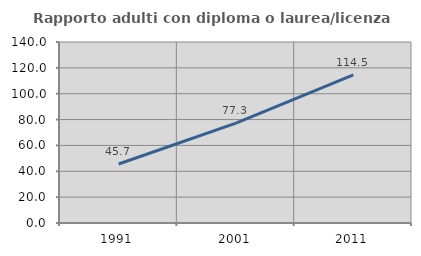
| Category | Rapporto adulti con diploma o laurea/licenza media  |
|---|---|
| 1991.0 | 45.659 |
| 2001.0 | 77.256 |
| 2011.0 | 114.533 |